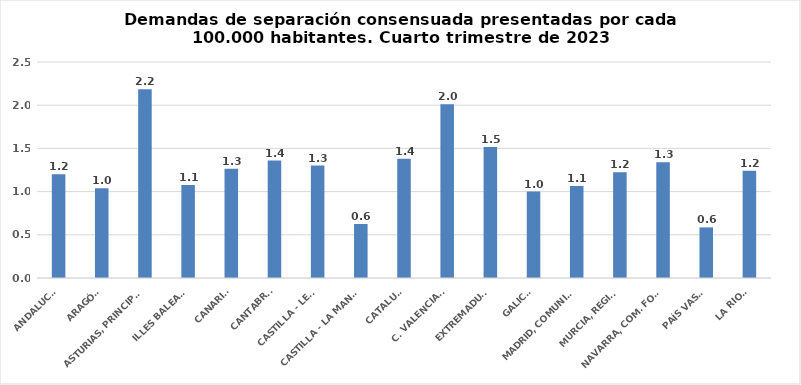
| Category | Series 0 |
|---|---|
| ANDALUCÍA | 1.201 |
| ARAGÓN | 1.038 |
| ASTURIAS, PRINCIPADO | 2.186 |
| ILLES BALEARS | 1.077 |
| CANARIAS | 1.265 |
| CANTABRIA | 1.359 |
| CASTILLA - LEÓN | 1.301 |
| CASTILLA - LA MANCHA | 0.625 |
| CATALUÑA | 1.38 |
| C. VALENCIANA | 2.012 |
| EXTREMADURA | 1.518 |
| GALICIA | 1 |
| MADRID, COMUNIDAD | 1.066 |
| MURCIA, REGIÓN | 1.224 |
| NAVARRA, COM. FORAL | 1.339 |
| PAÍS VASCO | 0.586 |
| LA RIOJA | 1.241 |